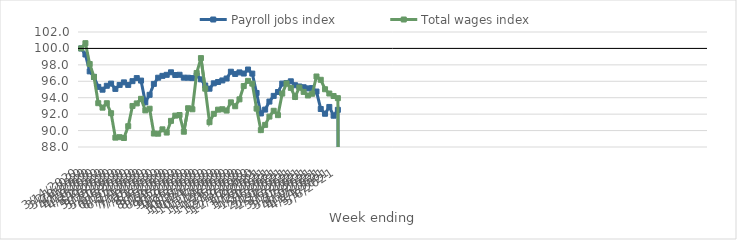
| Category | Payroll jobs index | Total wages index |
|---|---|---|
| 14/03/2020 | 100 | 100 |
| 21/03/2020 | 99.261 | 100.637 |
| 28/03/2020 | 97.205 | 98.101 |
| 04/04/2020 | 96.535 | 96.534 |
| 11/04/2020 | 95.317 | 93.333 |
| 18/04/2020 | 94.977 | 92.79 |
| 25/04/2020 | 95.454 | 93.329 |
| 02/05/2020 | 95.719 | 92.111 |
| 09/05/2020 | 95.072 | 89.141 |
| 16/05/2020 | 95.556 | 89.196 |
| 23/05/2020 | 95.869 | 89.095 |
| 30/05/2020 | 95.557 | 90.531 |
| 06/06/2020 | 96.016 | 92.997 |
| 13/06/2020 | 96.389 | 93.307 |
| 20/06/2020 | 96.084 | 93.866 |
| 27/06/2020 | 93.438 | 92.457 |
| 04/07/2020 | 94.354 | 92.661 |
| 11/07/2020 | 95.683 | 89.638 |
| 18/07/2020 | 96.436 | 89.619 |
| 25/07/2020 | 96.659 | 90.15 |
| 01/08/2020 | 96.788 | 89.759 |
| 08/08/2020 | 97.094 | 91.182 |
| 15/08/2020 | 96.763 | 91.819 |
| 22/08/2020 | 96.792 | 91.892 |
| 29/08/2020 | 96.439 | 89.861 |
| 05/09/2020 | 96.432 | 92.718 |
| 12/09/2020 | 96.39 | 92.592 |
| 19/09/2020 | 96.721 | 97.012 |
| 26/09/2020 | 96.235 | 98.823 |
| 03/10/2020 | 95.486 | 95.099 |
| 10/10/2020 | 95.099 | 91.024 |
| 17/10/2020 | 95.752 | 92.04 |
| 24/10/2020 | 95.913 | 92.548 |
| 31/10/2020 | 96.102 | 92.597 |
| 07/11/2020 | 96.336 | 92.436 |
| 14/11/2020 | 97.164 | 93.437 |
| 21/11/2020 | 96.891 | 92.962 |
| 28/11/2020 | 97.08 | 93.801 |
| 05/12/2020 | 96.944 | 95.42 |
| 12/12/2020 | 97.432 | 96.052 |
| 19/12/2020 | 96.936 | 95.714 |
| 26/12/2020 | 94.577 | 92.675 |
| 02/01/2021 | 92.085 | 90.053 |
| 09/01/2021 | 92.555 | 90.694 |
| 16/01/2021 | 93.531 | 91.705 |
| 23/01/2021 | 94.222 | 92.408 |
| 30/01/2021 | 94.692 | 91.877 |
| 06/02/2021 | 95.72 | 94.505 |
| 13/02/2021 | 95.793 | 95.738 |
| 20/02/2021 | 95.998 | 95.198 |
| 27/02/2021 | 95.52 | 94.088 |
| 06/03/2021 | 95.368 | 95.244 |
| 13/03/2021 | 95.275 | 94.709 |
| 20/03/2021 | 95.137 | 94.273 |
| 27/03/2021 | 95.17 | 94.483 |
| 03/04/2021 | 94.752 | 96.584 |
| 10/04/2021 | 92.627 | 96.181 |
| 17/04/2021 | 92.048 | 95.032 |
| 24/04/2021 | 92.876 | 94.51 |
| 01/05/2021 | 91.811 | 94.208 |
| 08/05/2021 | 92.523 | 93.948 |